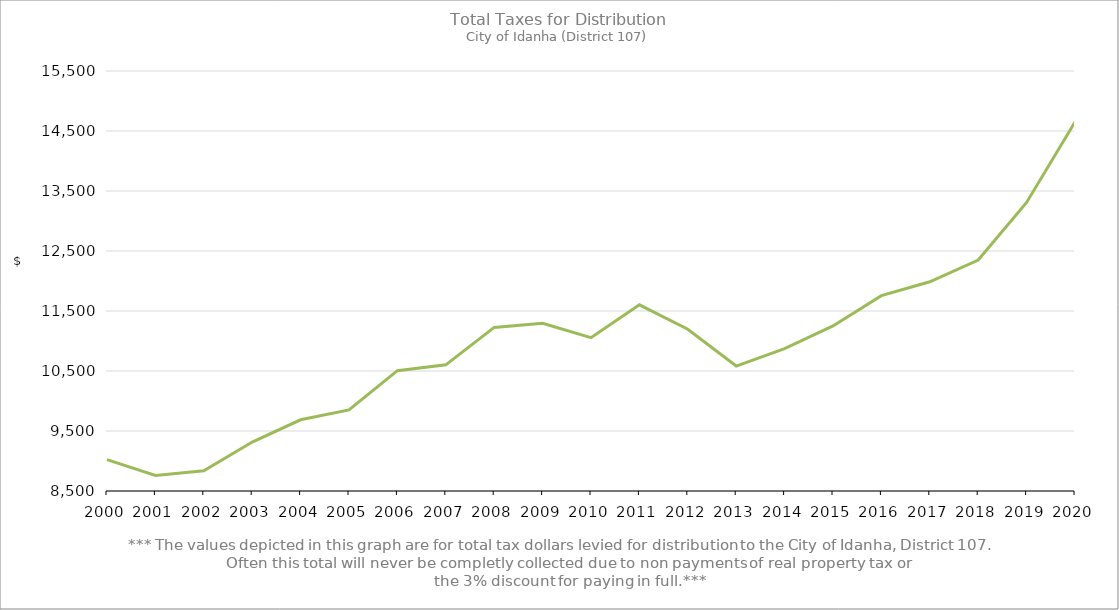
| Category | Series 0 |
|---|---|
| 2000.0 | 9024.17 |
| 2001.0 | 8757.87 |
| 2002.0 | 8838.34 |
| 2003.0 | 9316.24 |
| 2004.0 | 9687.13 |
| 2005.0 | 9851.61 |
| 2006.0 | 10505.6 |
| 2007.0 | 10602.41 |
| 2008.0 | 11226.39 |
| 2009.0 | 11295.52 |
| 2010.0 | 11054.93 |
| 2011.0 | 11603.02 |
| 2012.0 | 11196.15 |
| 2013.0 | 10582.21 |
| 2014.0 | 10872.56 |
| 2015.0 | 11250.6 |
| 2016.0 | 11756.2 |
| 2017.0 | 11987.51 |
| 2018.0 | 12348.74 |
| 2019.0 | 13309.2 |
| 2020.0 | 14650.76 |